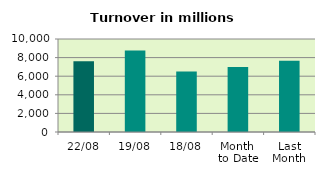
| Category | Series 0 |
|---|---|
| 22/08 | 7612.231 |
| 19/08 | 8757.454 |
| 18/08 | 6510.627 |
| Month 
to Date | 6975.862 |
| Last
Month | 7648.819 |